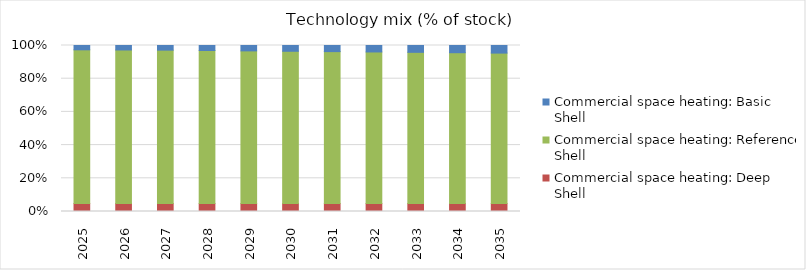
| Category | Commercial space heating: Deep Shell | Commercial space heating: Reference Shell | Commercial space heating: Basic Shell |
|---|---|---|---|
| 2025.0 | 0.048 | 0.926 | 0.026 |
| 2026.0 | 0.048 | 0.925 | 0.027 |
| 2027.0 | 0.048 | 0.924 | 0.028 |
| 2028.0 | 0.048 | 0.922 | 0.03 |
| 2029.0 | 0.048 | 0.92 | 0.032 |
| 2030.0 | 0.048 | 0.917 | 0.035 |
| 2031.0 | 0.048 | 0.915 | 0.037 |
| 2032.0 | 0.048 | 0.913 | 0.039 |
| 2033.0 | 0.048 | 0.911 | 0.041 |
| 2034.0 | 0.048 | 0.909 | 0.043 |
| 2035.0 | 0.048 | 0.906 | 0.046 |